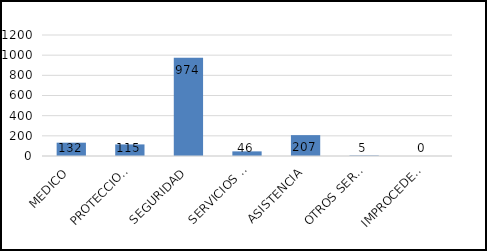
| Category | TOTAL |
|---|---|
| MEDICO | 132 |
| PROTECCION CIVIL | 115 |
| SEGURIDAD | 974 |
| SERVICIOS PUBLICOS | 46 |
| ASISTENCIA | 207 |
| OTROS SERVICIOS | 5 |
| IMPROCEDENTES | 0 |